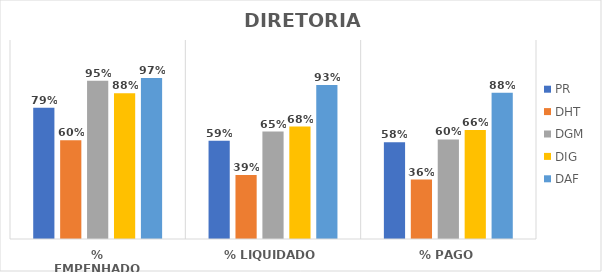
| Category | PR | DHT | DGM | DIG | DAF |
|---|---|---|---|---|---|
| % EMPENHADO | 0.791 | 0.595 | 0.954 | 0.879 | 0.971 |
| % LIQUIDADO | 0.592 | 0.385 | 0.648 | 0.678 | 0.928 |
| % PAGO | 0.583 | 0.359 | 0.601 | 0.657 | 0.882 |